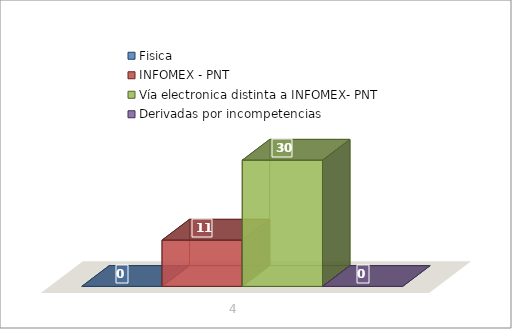
| Category | Fisica | INFOMEX - PNT | Vía electronica distinta a INFOMEX- PNT | Derivadas por incompetencias |
|---|---|---|---|---|
| 0 | 0 | 11 | 30 | 0 |